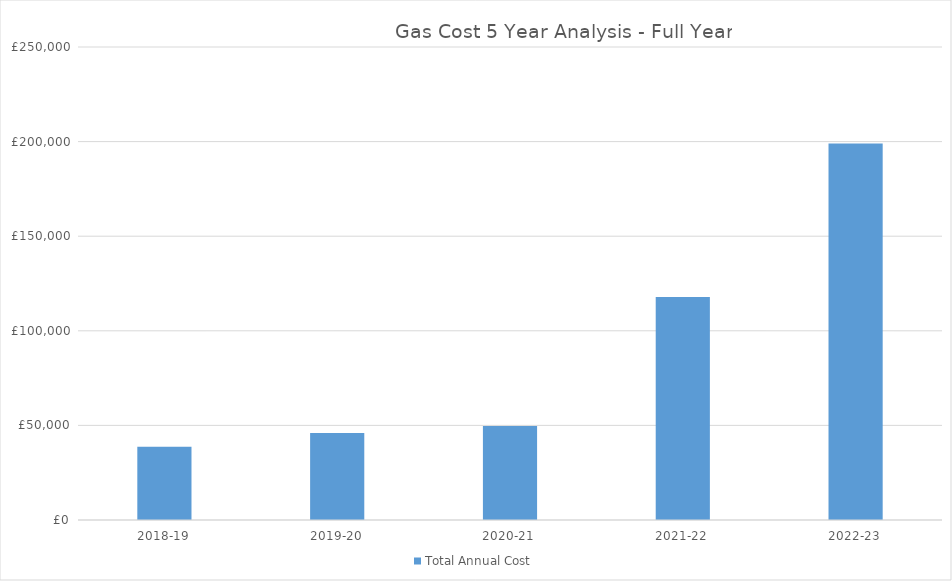
| Category | Total Annual Cost |
|---|---|
| 2018-19 | 38742.26 |
| 2019-20 | 45953.94 |
| 2020-21 | 49640 |
| 2021-22 | 117821 |
| 2022-23 | 198976.43 |